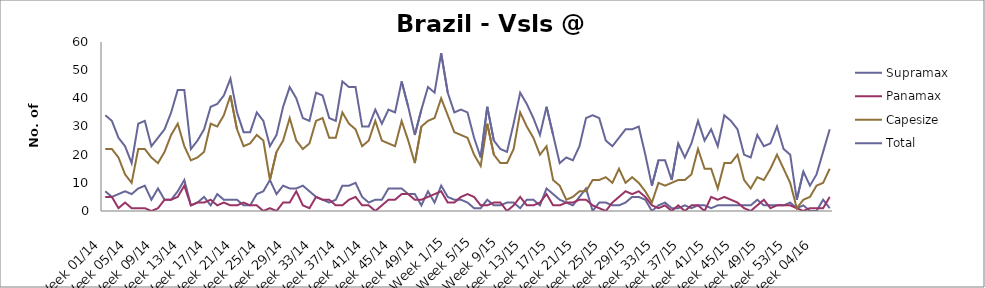
| Category | Supramax | Panamax | Capesize | Total |
|---|---|---|---|---|
| Week 01/14 | 7 | 5 | 22 | 34 |
| Week 02/14 | 5 | 5 | 22 | 32 |
| Week 03/14 | 6 | 1 | 19 | 26 |
| Week 04/14 | 7 | 3 | 13 | 23 |
| Week 05/14 | 6 | 1 | 10 | 17 |
| Week 06/14 | 8 | 1 | 22 | 31 |
| Week 07/14 | 9 | 1 | 22 | 32 |
| Week 08/14 | 4 | 0 | 19 | 23 |
| Week 09/14 | 8 | 1 | 17 | 26 |
| Week 10/14 | 4 | 4 | 21 | 29 |
| Week 11/14 | 4 | 4 | 27 | 35 |
| Week 12/14 | 7 | 5 | 31 | 43 |
| Week 13/14 | 11 | 9 | 23 | 43 |
| Week 14/14 | 2 | 2 | 18 | 22 |
| Week 15/14 | 3 | 3 | 19 | 25 |
| Week 16/14 | 5 | 3 | 21 | 29 |
| Week 17/14 | 2 | 4 | 31 | 37 |
| Week 18/14 | 6 | 2 | 30 | 38 |
| Week 19/14 | 4 | 3 | 34 | 41 |
| Week 20/14 | 4 | 2 | 41 | 47 |
| Week 21/14 | 4 | 2 | 29 | 35 |
| Week 22/14 | 2 | 3 | 23 | 28 |
| Week 23/14 | 2 | 2 | 24 | 28 |
| Week 24/14 | 6 | 2 | 27 | 35 |
| Week 25/14 | 7 | 0 | 25 | 32 |
| Week 26/14 | 11 | 1 | 11 | 23 |
| Week 27/14 | 6 | 0 | 21 | 27 |
| Week 28/14 | 9 | 3 | 25 | 37 |
| Week 29/14 | 8 | 3 | 33 | 44 |
| Week 30/14 | 8 | 7 | 25 | 40 |
| Week 31/14 | 9 | 2 | 22 | 33 |
| Week 32/14 | 7 | 1 | 24 | 32 |
| Week 33/14 | 5 | 5 | 32 | 42 |
| Week 34/14 | 4 | 4 | 33 | 41 |
| Week 35/14 | 3 | 4 | 26 | 33 |
| Week 36/14 | 4 | 2 | 26 | 32 |
| Week 37/14 | 9 | 2 | 35 | 46 |
| Week 38/14 | 9 | 4 | 31 | 44 |
| Week 39/14 | 10 | 5 | 29 | 44 |
| Week 40/14 | 5 | 2 | 23 | 30 |
| Week 41/14 | 3 | 2 | 25 | 30 |
| Week 42/14 | 4 | 0 | 32 | 36 |
| Week 43/14 | 4 | 2 | 25 | 31 |
| Week 44/14 | 8 | 4 | 24 | 36 |
| Week 45/14 | 8 | 4 | 23 | 35 |
| Week 46/14 | 8 | 6 | 32 | 46 |
| Week 47/14 | 6 | 6 | 25 | 37 |
| Week 48/14 | 6 | 4 | 17 | 27 |
| Week 49/14 | 2 | 4 | 30 | 36 |
| Week 50/14 | 7 | 5 | 32 | 44 |
| Week 51/14 | 3 | 6 | 33 | 42 |
| Week 52/14 | 9 | 7 | 40 | 56 |
| Week 1/15 | 5 | 3 | 34 | 42 |
| Week 2/15 | 4 | 3 | 28 | 35 |
| Week 3/15 | 4 | 5 | 27 | 36 |
| Week 4/15 | 3 | 6 | 26 | 35 |
| Week 5/15 | 1 | 5 | 20 | 26 |
| Week 6/15 | 1 | 2 | 16 | 19 |
| Week 7/15 | 4 | 2 | 31 | 37 |
| Week 8/15 | 2 | 3 | 20 | 25 |
| Week 9/15 | 2 | 3 | 17 | 22 |
| Week 10/15 | 3 | 0 | 17 | 21 |
| Week 11/15 | 3 | 2 | 22 | 31 |
| Week 12/15 | 1 | 5 | 35 | 42 |
| Week 13/15 | 4 | 2 | 30 | 38 |
| Week 14/15 | 4 | 2 | 26 | 33 |
| Week 15/15 | 2 | 3 | 20 | 27 |
| Week 16/15 | 8 | 6 | 23 | 37 |
| Week 17/15 | 6 | 2 | 11 | 27 |
| Week 18/15 | 4 | 2 | 9 | 17 |
| Week 19/15 | 3 | 3 | 4 | 19 |
| Week 20/15 | 2 | 3 | 5 | 18 |
| Week 21/15 | 5 | 4 | 7 | 23 |
| Week 22/15 | 8 | 4 | 7 | 33 |
| Week 23/15 | 0 | 2 | 11 | 34 |
| Week 24/15 | 3 | 1 | 11 | 33 |
| Week 25/15 | 3 | 0 | 12 | 25 |
| Week 26/15 | 2 | 3 | 10 | 23 |
| Week 27/15 | 2 | 5 | 15 | 26 |
| Week 28/15 | 3 | 7 | 10 | 29 |
| Week 29/15 | 5 | 6 | 12 | 29 |
| Week 30/15 | 5 | 7 | 10 | 30 |
| Week 31/15 | 4 | 5 | 7 | 20 |
| Week 32/15 | 0 | 2 | 3 | 9 |
| Week 33/15 | 2 | 1 | 10 | 18 |
| Week 34/15 | 3 | 2 | 9 | 18 |
| Week 35/15 | 1 | 0 | 10 | 11 |
| Week 36/15 | 1 | 2 | 11 | 24 |
| Week 37/15 | 2 | 0 | 11 | 19 |
| Week 38/15 | 1 | 2 | 13 | 24 |
| Week 39/15 | 2 | 2 | 22 | 32 |
| Week 40/15 | 2 | 0 | 15 | 25 |
| Week 41/15 | 1 | 5 | 15 | 29 |
| Week 42/15 | 2 | 4 | 8 | 23 |
| Week 43/15 | 2 | 5 | 17 | 34 |
| Week 44/15 | 2 | 4 | 17 | 32 |
| Week 45/15 | 2 | 3 | 20 | 29 |
| Week 46/15 | 2 | 1 | 11 | 20 |
| Week 47/15 | 2 | 0 | 8 | 19 |
| Week 48/15 | 4 | 2 | 12 | 27 |
| Week 49/15 | 2 | 4 | 11 | 23 |
| Week 50/15 | 2 | 1 | 15 | 24 |
| Week 51/15 | 2 | 2 | 20 | 30 |
| Week 52/15 | 2 | 2 | 15 | 22 |
| Week 53/15 | 3 | 2 | 10 | 20 |
| Week 01/16 | 1 | 1 | 1 | 4 |
| Week 02/16 | 2 | 0 | 4 | 14 |
| Week 03/16 | 0 | 1 | 5 | 9 |
| Week 04/16 | 0 | 1 | 9 | 13 |
| Week 05/16 | 4 | 1 | 10 | 21 |
| Week 06/16 | 1 | 5 | 15 | 29 |